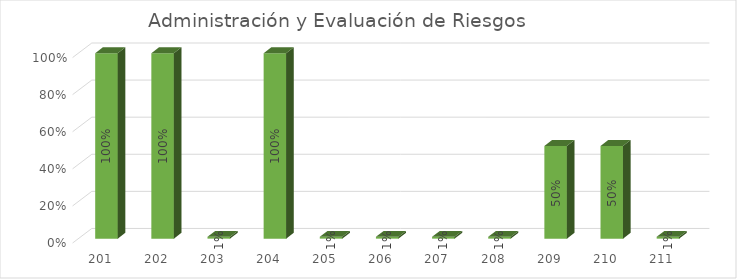
| Category | % Avance |
|---|---|
| 201.0 | 1 |
| 202.0 | 1 |
| 203.0 | 0.01 |
| 204.0 | 1 |
| 205.0 | 0.01 |
| 206.0 | 0.01 |
| 207.0 | 0.01 |
| 208.0 | 0.01 |
| 209.0 | 0.5 |
| 210.0 | 0.5 |
| 211.0 | 0.01 |